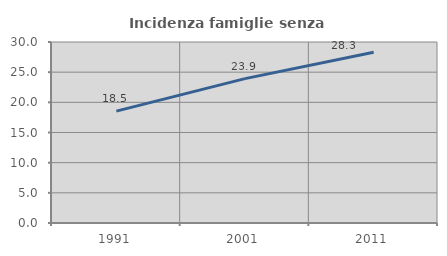
| Category | Incidenza famiglie senza nuclei |
|---|---|
| 1991.0 | 18.546 |
| 2001.0 | 23.933 |
| 2011.0 | 28.299 |